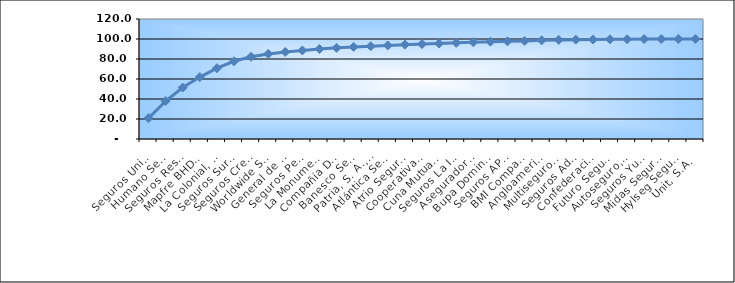
| Category | Series 0 |
|---|---|
| Seguros Universal, S. A. | 20.831 |
| Humano Seguros, S. A. | 37.922 |
| Seguros Reservas, S. A. | 51.412 |
| Mapfre BHD Compañía de Seguros | 61.919 |
| La Colonial, S. A., Compañia De Seguros | 70.828 |
| Seguros Sura, S.A. | 77.738 |
| Seguros Crecer, S. A. | 82.231 |
| Worldwide Seguros, S. A. | 85.103 |
| General de Seguros, S. A. | 87.048 |
| Seguros Pepín, S. A. | 88.575 |
| La Monumental de Seguros, S. A. | 90.045 |
| Compañía Dominicana de Seguros, C. por A. | 91.176 |
| Banesco Seguros | 92.094 |
| Patria, S. A., Compañía de Seguros | 92.773 |
| Atlántica Seguros, S. A. | 93.569 |
| Atrio Seguros S. A. | 94.363 |
| Cooperativa Nacional De Seguros, Inc  | 94.978 |
| Cuna Mutual Insurance Society Dominicana | 95.541 |
| Seguros La Internacional, S. A. | 96.157 |
| Aseguradora Agropecuaria Dominicana, S. A. | 96.858 |
| Bupa Dominicana, S. A. | 97.352 |
| Seguros APS, S.R.L. | 97.669 |
| BMI Compañía de Seguros, S. A. | 98.124 |
| Angloamericana de Seguros, S. A. | 98.641 |
| Multiseguros Su, S.A. | 99.063 |
| Seguros Ademi, S.A. | 99.33 |
| Confederación del Canadá Dominicana, S. A. | 99.465 |
| Futuro Seguros | 99.738 |
| Autoseguro, S. A. | 99.794 |
| Seguros Yunen, S.A. | 99.93 |
| Midas Seguros, S.A. | 99.953 |
| Hylseg Seguros S.A | 99.964 |
| Unit, S.A. | 100 |